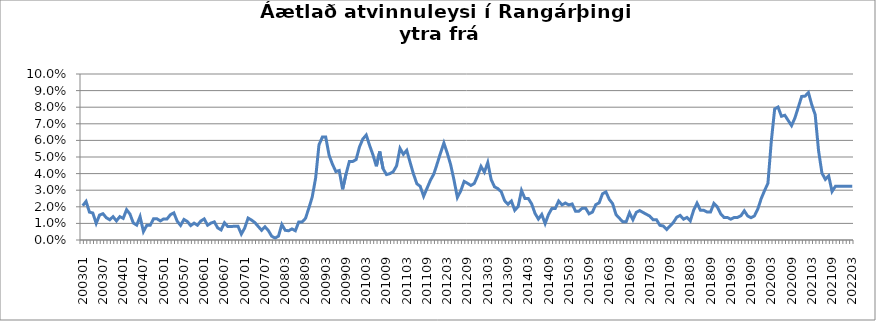
| Category | Series 0 |
|---|---|
| 200301 | 0.021 |
| 200302 | 0.023 |
| 200303 | 0.017 |
| 200304 | 0.016 |
| 200305 | 0.01 |
| 200306 | 0.015 |
| 200307 | 0.016 |
| 200308 | 0.013 |
| 200309 | 0.012 |
| 200310 | 0.014 |
| 200311 | 0.012 |
| 200312 | 0.014 |
| 200401 | 0.013 |
| 200402 | 0.018 |
| 200403 | 0.016 |
| 200404 | 0.01 |
| 200405 | 0.009 |
| 200406 | 0.014 |
| 200407 | 0.005 |
| 200408 | 0.009 |
| 200409 | 0.009 |
| 200410 | 0.013 |
| 200411 | 0.013 |
| 200412 | 0.011 |
| 200501 | 0.013 |
| 200502 | 0.013 |
| 200503 | 0.015 |
| 200504 | 0.016 |
| 200505 | 0.011 |
| 200506 | 0.009 |
| 200507 | 0.012 |
| 200508 | 0.011 |
| 200509 | 0.009 |
| 200510 | 0.01 |
| 200511 | 0.009 |
| 200512 | 0.011 |
| 200601 | 0.013 |
| 200602 | 0.009 |
| 200603 | 0.01 |
| 200604 | 0.011 |
| 200605 | 0.007 |
| 200606 | 0.006 |
| 200607 | 0.01 |
| 200608 | 0.008 |
| 200609 | 0.008 |
| 200610 | 0.008 |
| 200611 | 0.008 |
| 200612 | 0.004 |
| 200701 | 0.007 |
| 200702 | 0.013 |
| 200703 | 0.012 |
| 200704 | 0.011 |
| 200705 | 0.008 |
| 200706 | 0.006 |
| 200707 | 0.008 |
| 200708 | 0.006 |
| 200709 | 0.002 |
| 200710 | 0.001 |
| 200801 | 0.002 |
| 200802 | 0.009 |
| 200803 | 0.006 |
| 200804 | 0.006 |
| 200805 | 0.007 |
| 200806 | 0.006 |
| 200807 | 0.011 |
| 200808 | 0.011 |
| 200809 | 0.013 |
| 200810 | 0.019 |
| 200811 | 0.026 |
| 200812 | 0.037 |
| 200901 | 0.057 |
| 200902 | 0.062 |
| 200903 | 0.062 |
| 200904 | 0.051 |
| 200905 | 0.046 |
| 200906 | 0.041 |
| 200907 | 0.042 |
| 200908 | 0.031 |
| 200909 | 0.04 |
| 200910 | 0.047 |
| 200911 | 0.047 |
| 200912 | 0.048 |
| 201001 | 0.056 |
| 201002 | 0.061 |
| 201003 | 0.063 |
| 201004 | 0.057 |
| 201005 | 0.051 |
| 201006 | 0.044 |
| 201007 | 0.053 |
| 201008 | 0.043 |
| 201009 | 0.039 |
| 201010 | 0.04 |
| 201011 | 0.041 |
| 201012 | 0.045 |
| 201101 | 0.055 |
| 201102 | 0.052 |
| 201103 | 0.054 |
| 201104 | 0.047 |
| 201105 | 0.04 |
| 201106 | 0.034 |
| 201107 | 0.032 |
| 201108 | 0.026 |
| 201109 | 0.031 |
| 201110 | 0.036 |
| 201111 | 0.04 |
| 201112 | 0.046 |
| 201201 | 0.052 |
| 201202 | 0.058 |
| 201203 | 0.052 |
| 201204 | 0.045 |
| 201205 | 0.036 |
| 201206 | 0.026 |
| 201207 | 0.03 |
| 201208 | 0.035 |
| 201209 | 0.034 |
| 201210 | 0.033 |
| 201211 | 0.034 |
| 201212 | 0.039 |
| 201301 | 0.044 |
| 201302 | 0.041 |
| 201303 | 0.047 |
| 201304 | 0.036 |
| 201305 | 0.032 |
| 201306 | 0.031 |
| 201307 | 0.029 |
| 201308 | 0.024 |
| 201309 | 0.022 |
| 201310 | 0.023 |
| 201311 | 0.018 |
| 201312 | 0.02 |
| 201401 | 0.03 |
| 201402 | 0.025 |
| 201403 | 0.025 |
| 201404 | 0.022 |
| 201405 | 0.016 |
| 201406 | 0.013 |
| 201407 | 0.015 |
| 201408 | 0.01 |
| 201409 | 0.015 |
| 201410 | 0.019 |
| 201411 | 0.019 |
| 201412 | 0.023 |
| 201501 | 0.021 |
| 201502 | 0.022 |
| 201503 | 0.021 |
| 201504 | 0.022 |
| 201505 | 0.017 |
| 201506 | 0.017 |
| 201507 | 0.019 |
| 201508 | 0.019 |
| 201509 | 0.016 |
| 201510 | 0.017 |
| 201511 | 0.021 |
| 201512 | 0.022 |
| 201601 | 0.028 |
| 201602 | 0.029 |
| 201603 | 0.024 |
| 201604 | 0.022 |
| 201605 | 0.015 |
| 201606 | 0.013 |
| 201607 | 0.011 |
| 201608 | 0.011 |
| 201609 | 0.016 |
| 201610 | 0.012 |
| 201611 | 0.017 |
| 201612 | 0.018 |
| 201701 | 0.017 |
| 201702 | 0.015 |
| 201703 | 0.014 |
| 201704 | 0.012 |
| 201705 | 0.012 |
| 201706 | 0.009 |
| 201707 | 0.008 |
| 201708 | 0.006 |
| 201709 | 0.008 |
| 201710 | 0.011 |
| 201711 | 0.014 |
| 201712 | 0.015 |
| 201801 | 0.013 |
| 201802 | 0.014 |
| 201803 | 0.012 |
| 201804 | 0.018 |
| 201805 | 0.022 |
| 201806 | 0.018 |
| 201807 | 0.018 |
| 201808 | 0.017 |
| 201809 | 0.017 |
| 201810 | 0.022 |
| 201811 | 0.02 |
| 201812 | 0.016 |
| 201901 | 0.014 |
| 201902 | 0.014 |
| 201903 | 0.013 |
| 201904 | 0.014 |
| 201905 | 0.014 |
| 201906 | 0.015 |
| 201907 | 0.018 |
| 201908 | 0.014 |
| 201909 | 0.013 |
| 201910 | 0.015 |
| 201911 | 0.019 |
| 201912 | 0.025 |
| 202001 | 0.03 |
| 202002 | 0.034 |
| 202003 | 0.059 |
| 202004 | 0.079 |
| 202005 | 0.08 |
| 202006 | 0.075 |
| 202007 | 0.075 |
| 202008 | 0.072 |
| 202009 | 0.069 |
| 202010 | 0.074 |
| 202011 | 0.08 |
| 202012 | 0.086 |
| 202101 | 0.087 |
| 202102 | 0.089 |
| 202103 | 0.081 |
| 202104 | 0.075 |
| 202105 | 0.054 |
| 202106 | 0.04 |
| 202107 | 0.037 |
| 202108 | 0.039 |
| 202109 | 0.029 |
| 202110 | 0.032 |
| 202111 | 0.032 |
| 202112 | 0.032 |
| 202201 | 0.032 |
| 202202 | 0.032 |
| 202203 | 0.032 |